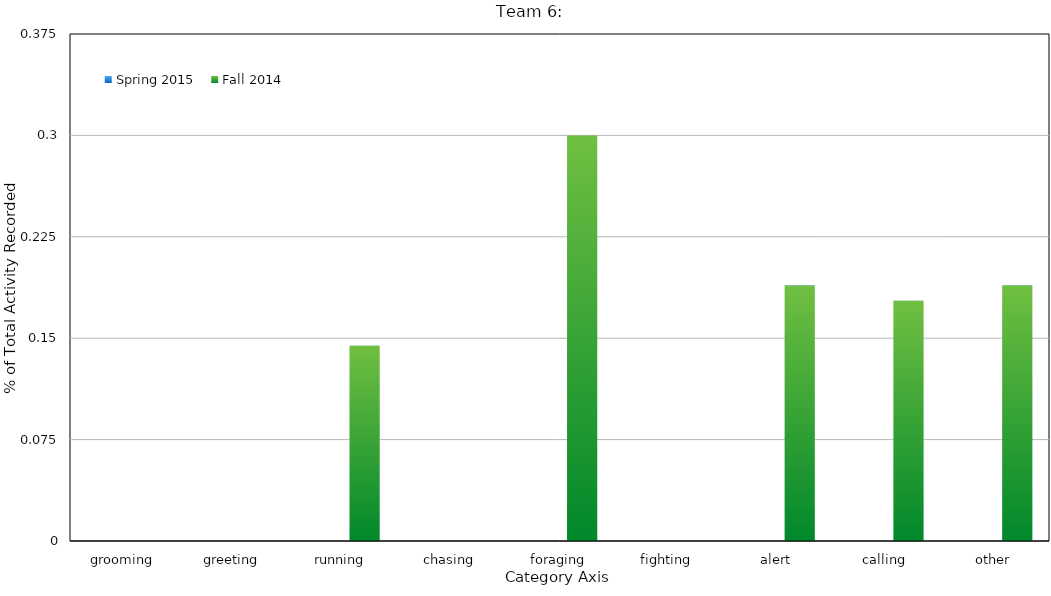
| Category | Spring 2015 | Fall 2014 |
|---|---|---|
| grooming |  | 0 |
| greeting |  | 0 |
| running |  | 0.144 |
| chasing |  | 0 |
| foraging |  | 0.3 |
| fighting |  | 0 |
| alert |  | 0.189 |
| calling |  | 0.178 |
| other |  | 0.189 |